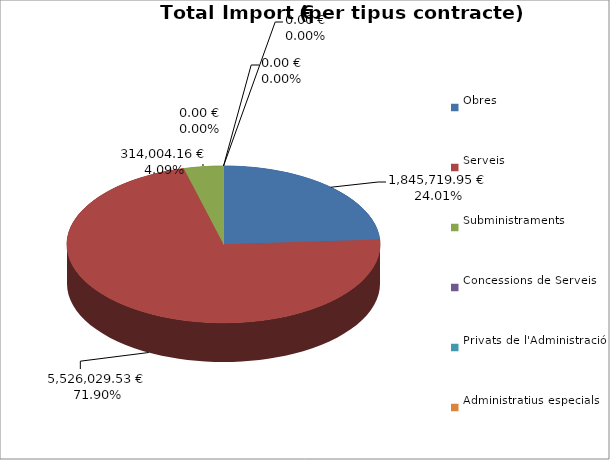
| Category | Total preu
(amb IVA) |
|---|---|
| Obres | 1845719.95 |
| Serveis | 5526029.53 |
| Subministraments | 314004.16 |
| Concessions de Serveis | 0 |
| Privats de l'Administració | 0 |
| Administratius especials | 0 |